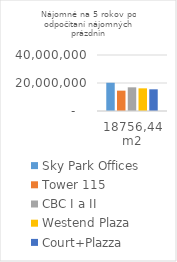
| Category | Sky Park Offices | Tower 115 | CBC I a II | Westend Plaza | Court+Plazza |
|---|---|---|---|---|---|
| 18756,44 m2 | 20182281.9 | 14539975.098 | 16914557.592 | 16190166.69 | 15492686.69 |